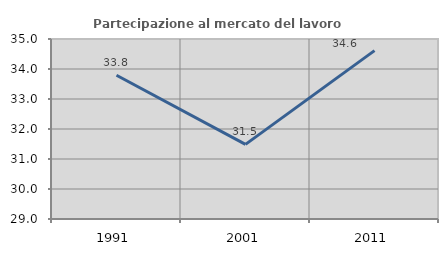
| Category | Partecipazione al mercato del lavoro  femminile |
|---|---|
| 1991.0 | 33.793 |
| 2001.0 | 31.489 |
| 2011.0 | 34.612 |